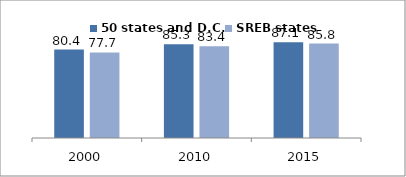
| Category | 50 states and D.C. | SREB states |
|---|---|---|
| 2000.0 | 80.399 | 77.731 |
| 2010.0 | 85.307 | 83.441 |
| 2015.0 | 87.144 | 85.838 |